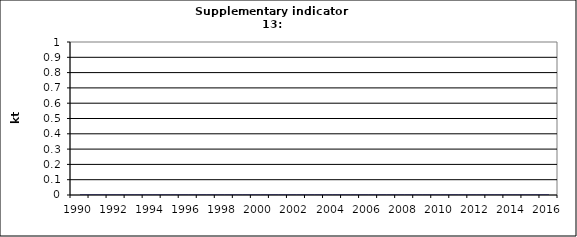
| Category | Physical output of paper, kt |
|---|---|
| 1990 | 0 |
| 1991 | 0 |
| 1992 | 0 |
| 1993 | 0 |
| 1994 | 0 |
| 1995 | 0 |
| 1996 | 0 |
| 1997 | 0 |
| 1998 | 0 |
| 1999 | 0 |
| 2000 | 0 |
| 2001 | 0 |
| 2002 | 0 |
| 2003 | 0 |
| 2004 | 0 |
| 2005 | 0 |
| 2006 | 0 |
| 2007 | 0 |
| 2008 | 0 |
| 2009 | 0 |
| 2010 | 0 |
| 2011 | 0 |
| 2012 | 0 |
| 2013 | 0 |
| 2014 | 0 |
| 2015 | 0 |
| 2016 | 0 |